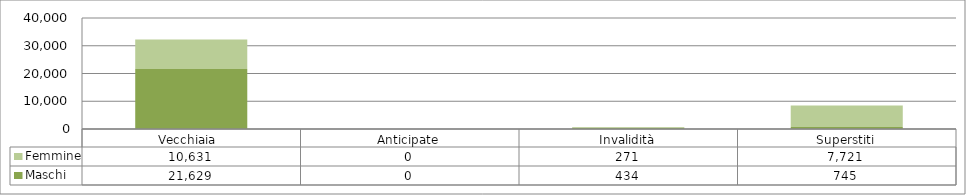
| Category | Maschi | Femmine |
|---|---|---|
| Vecchiaia  | 21629 | 10631 |
| Anticipate | 0 | 0 |
| Invalidità | 434 | 271 |
| Superstiti | 745 | 7721 |